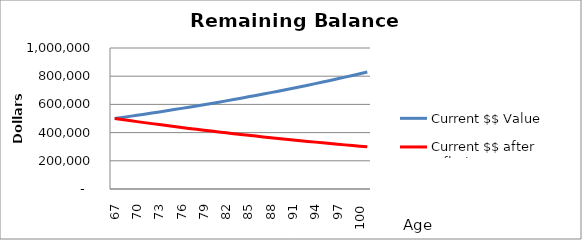
| Category | Current $$ Value | Current $$ after Inflation |
|---|---|---|
| 67.0 | 500000 | 500000 |
| 68.0 | 507500 | 492500 |
| 69.0 | 515112.5 | 485112.5 |
| 70.0 | 522839.187 | 477835.812 |
| 71.0 | 530681.775 | 470668.275 |
| 72.0 | 538642.002 | 463608.251 |
| 73.0 | 546721.632 | 456654.127 |
| 74.0 | 554922.456 | 449804.316 |
| 75.0 | 563246.293 | 443057.251 |
| 76.0 | 571694.988 | 436411.392 |
| 77.0 | 580270.413 | 429865.221 |
| 78.0 | 588974.469 | 423417.243 |
| 79.0 | 597809.086 | 417065.984 |
| 80.0 | 606776.222 | 410809.994 |
| 81.0 | 615877.865 | 404647.844 |
| 82.0 | 625116.033 | 398578.127 |
| 83.0 | 634492.774 | 392599.455 |
| 84.0 | 644010.165 | 386710.463 |
| 85.0 | 653670.318 | 380909.806 |
| 86.0 | 663475.373 | 375196.159 |
| 87.0 | 673427.503 | 369568.217 |
| 88.0 | 683528.916 | 364024.693 |
| 89.0 | 693781.85 | 358564.323 |
| 90.0 | 704188.577 | 353185.858 |
| 91.0 | 714751.406 | 347888.07 |
| 92.0 | 725472.677 | 342669.749 |
| 93.0 | 736354.767 | 337529.703 |
| 94.0 | 747400.089 | 332466.757 |
| 95.0 | 758611.09 | 327479.756 |
| 96.0 | 769990.256 | 322567.56 |
| 97.0 | 781540.11 | 317729.046 |
| 98.0 | 793263.212 | 312963.111 |
| 99.0 | 805162.16 | 308268.664 |
| 100.0 | 817239.592 | 303644.634 |
| 101.0 | 829498.186 | 299089.965 |